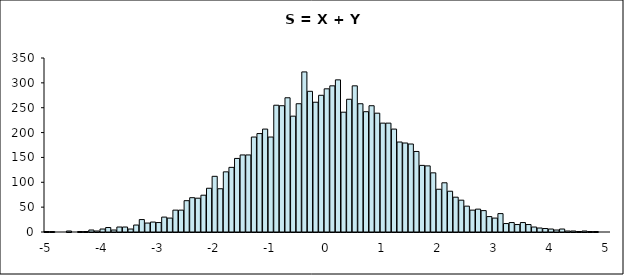
| Category | Series 0 |
|---|---|
| -5.0 | 1 |
| -4.9 | 1 |
| -4.8 | 0 |
| -4.7 | 0 |
| -4.6 | 2 |
| -4.5 | 0 |
| -4.4 | 1 |
| -4.3 | 1 |
| -4.2 | 4 |
| -4.1 | 2 |
| -4.0 | 6 |
| -3.9 | 9 |
| -3.8 | 4 |
| -3.7 | 10 |
| -3.6 | 10 |
| -3.5 | 6 |
| -3.4 | 14 |
| -3.3 | 25 |
| -3.2 | 18 |
| -3.1 | 20 |
| -3.0 | 19 |
| -2.9 | 30 |
| -2.8 | 28 |
| -2.7 | 44 |
| -2.6 | 44 |
| -2.5 | 63 |
| -2.4 | 69 |
| -2.3 | 68 |
| -2.2 | 74 |
| -2.1 | 88 |
| -2.0 | 112 |
| -1.9 | 87 |
| -1.8 | 121 |
| -1.7 | 130 |
| -1.6 | 148 |
| -1.5 | 155 |
| -1.4 | 155 |
| -1.3 | 191 |
| -1.2 | 198 |
| -1.1 | 207 |
| -1.0 | 191 |
| -0.9 | 255 |
| -0.8 | 254 |
| -0.7 | 270 |
| -0.6 | 233 |
| -0.5 | 258 |
| -0.4 | 322 |
| -0.3 | 283 |
| -0.2 | 261 |
| -0.1 | 275 |
| 0.0 | 288 |
| 0.1 | 294 |
| 0.2 | 306 |
| 0.3 | 241 |
| 0.4 | 267 |
| 0.5 | 294 |
| 0.6 | 258 |
| 0.7 | 242 |
| 0.8 | 254 |
| 0.9 | 239 |
| 1.0 | 219 |
| 1.1 | 219 |
| 1.2 | 207 |
| 1.3 | 181 |
| 1.4 | 179 |
| 1.5 | 177 |
| 1.6 | 162 |
| 1.7 | 134 |
| 1.8 | 133 |
| 1.9 | 119 |
| 2.0 | 86 |
| 2.1 | 99 |
| 2.2 | 82 |
| 2.3 | 70 |
| 2.40000000000001 | 64 |
| 2.5 | 52 |
| 2.6 | 44 |
| 2.70000000000001 | 46 |
| 2.80000000000001 | 43 |
| 2.90000000000001 | 31 |
| 3.0 | 28 |
| 3.09999999999999 | 37 |
| 3.19999999999998 | 17 |
| 3.29999999999997 | 19 |
| 3.39999999999996 | 15 |
| 3.49999999999995 | 19 |
| 3.59999999999994 | 15 |
| 3.69999999999993 | 10 |
| 3.79999999999992 | 8 |
| 3.89999999999991 | 7 |
| 3.9999999999999 | 6 |
| 4.09999999999989 | 4 |
| 4.19999999999988 | 6 |
| 4.29999999999987 | 2 |
| 4.39999999999986 | 2 |
| 4.49999999999985 | 1 |
| 4.59999999999984 | 2 |
| 4.69999999999983 | 1 |
| 4.79999999999982 | 1 |
| 4.89999999999981 | 0 |
| 4.9999999999998 | 0 |